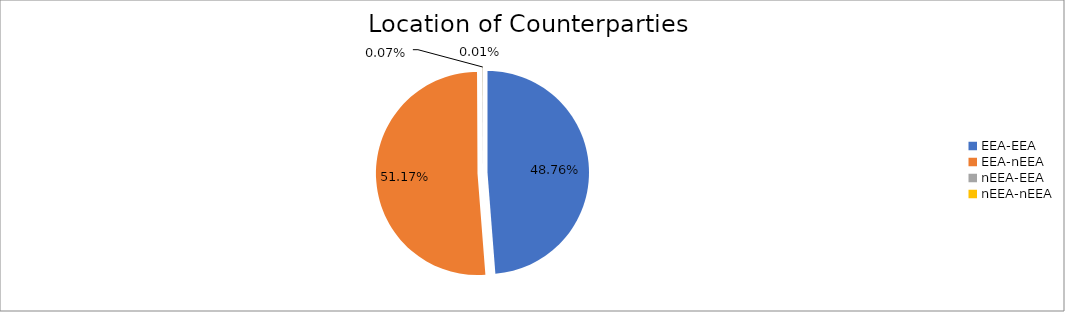
| Category | Series 0 |
|---|---|
| EEA-EEA | 6188261.657 |
| EEA-nEEA | 6493454.407 |
| nEEA-EEA | 8543.826 |
| nEEA-nEEA | 910.258 |